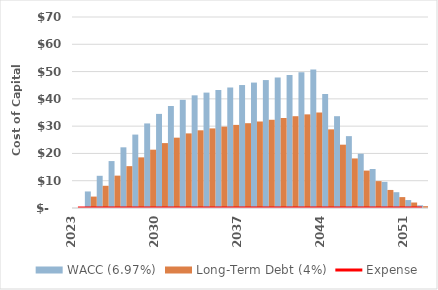
| Category | WACC (6.97%) | Long-Term Debt (4%) |
|---|---|---|
| 2023.0 | 0 | 0 |
| 2024.0 | 6.065 | 4.182 |
| 2025.0 | 11.802 | 8.14 |
| 2026.0 | 17.199 | 11.861 |
| 2027.0 | 22.239 | 15.338 |
| 2028.0 | 26.908 | 18.557 |
| 2029.0 | 30.994 | 21.375 |
| 2030.0 | 34.488 | 23.785 |
| 2031.0 | 37.377 | 25.777 |
| 2032.0 | 39.649 | 27.344 |
| 2033.0 | 41.292 | 28.477 |
| 2034.0 | 42.292 | 29.167 |
| 2035.0 | 43.245 | 29.824 |
| 2036.0 | 44.164 | 30.458 |
| 2037.0 | 45.066 | 31.08 |
| 2038.0 | 45.967 | 31.701 |
| 2039.0 | 46.886 | 32.335 |
| 2040.0 | 47.824 | 32.982 |
| 2041.0 | 48.78 | 33.642 |
| 2042.0 | 49.756 | 34.315 |
| 2043.0 | 50.751 | 35.001 |
| 2044.0 | 41.79 | 28.82 |
| 2045.0 | 33.647 | 23.205 |
| 2046.0 | 26.338 | 18.164 |
| 2047.0 | 19.882 | 13.711 |
| 2048.0 | 14.293 | 9.857 |
| 2049.0 | 9.591 | 6.614 |
| 2050.0 | 5.792 | 3.995 |
| 2051.0 | 2.915 | 2.01 |
| 2052.0 | 0.978 | 0.675 |